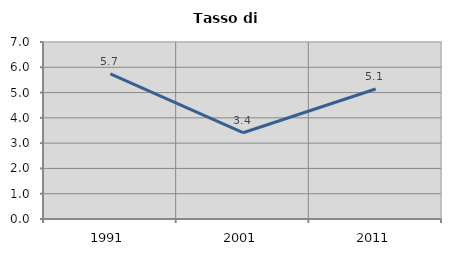
| Category | Tasso di disoccupazione   |
|---|---|
| 1991.0 | 5.738 |
| 2001.0 | 3.413 |
| 2011.0 | 5.142 |